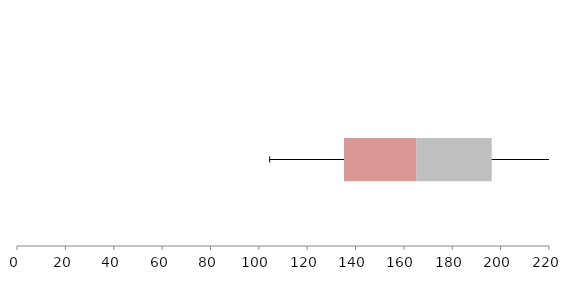
| Category | Series 1 | Series 2 | Series 3 |
|---|---|---|---|
| 0 | 135.242 | 29.841 | 31.239 |